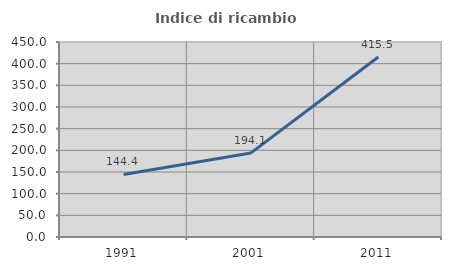
| Category | Indice di ricambio occupazionale  |
|---|---|
| 1991.0 | 144.405 |
| 2001.0 | 194.055 |
| 2011.0 | 415.48 |